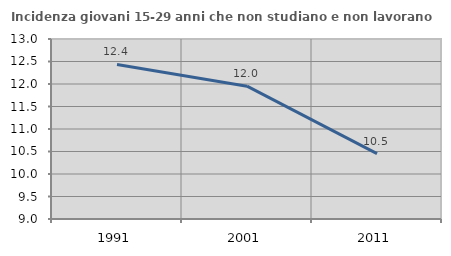
| Category | Incidenza giovani 15-29 anni che non studiano e non lavorano  |
|---|---|
| 1991.0 | 12.435 |
| 2001.0 | 11.952 |
| 2011.0 | 10.455 |